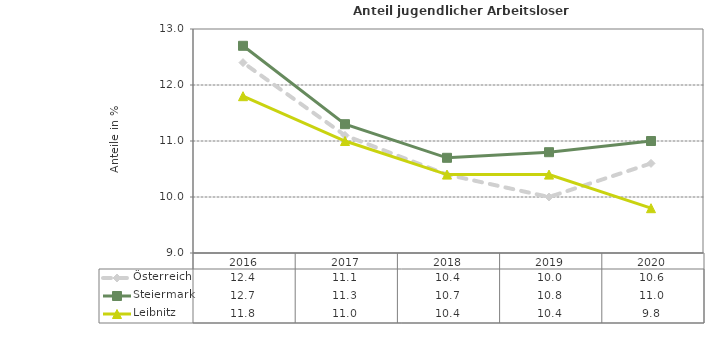
| Category | Österreich | Steiermark | Leibnitz |
|---|---|---|---|
| 2020.0 | 10.6 | 11 | 9.8 |
| 2019.0 | 10 | 10.8 | 10.4 |
| 2018.0 | 10.4 | 10.7 | 10.4 |
| 2017.0 | 11.1 | 11.3 | 11 |
| 2016.0 | 12.4 | 12.7 | 11.8 |